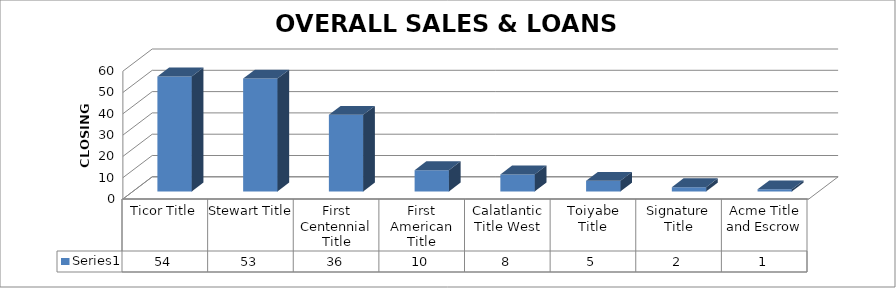
| Category | Series 0 |
|---|---|
| Ticor Title | 54 |
| Stewart Title | 53 |
| First Centennial Title | 36 |
| First American Title | 10 |
| Calatlantic Title West | 8 |
| Toiyabe Title | 5 |
| Signature Title | 2 |
| Acme Title and Escrow | 1 |